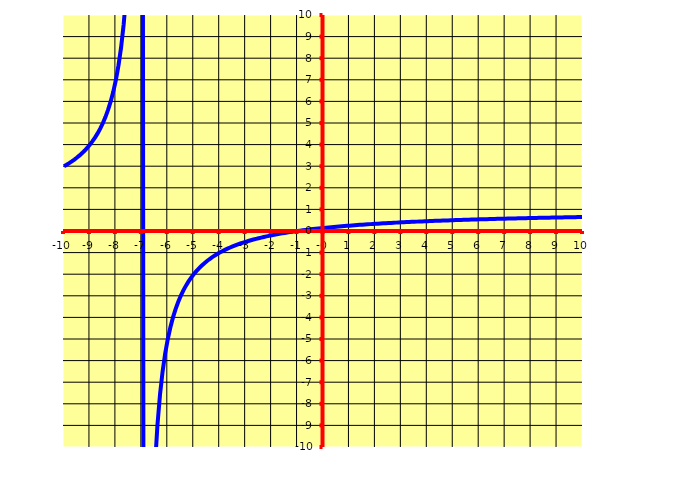
| Category | f(x) |
|---|---|
| -10.0 | 3 |
| -9.9 | 3.069 |
| -9.8 | 3.143 |
| -9.7 | 3.222 |
| -9.6 | 3.308 |
| -9.5 | 3.4 |
| -9.4 | 3.5 |
| -9.3 | 3.609 |
| -9.2 | 3.727 |
| -9.1 | 3.857 |
| -9.0 | 4 |
| -8.9 | 4.158 |
| -8.8 | 4.333 |
| -8.7 | 4.529 |
| -8.6 | 4.75 |
| -8.50000000000001 | 5 |
| -8.40000000000001 | 5.286 |
| -8.30000000000001 | 5.615 |
| -8.20000000000001 | 6 |
| -8.10000000000001 | 6.455 |
| -8.00000000000001 | 7 |
| -7.90000000000001 | 7.667 |
| -7.80000000000001 | 8.5 |
| -7.70000000000001 | 9.571 |
| -7.60000000000001 | 11 |
| -7.50000000000001 | 13 |
| -7.40000000000001 | 16 |
| -7.30000000000001 | 21 |
| -7.20000000000001 | 31 |
| -7.10000000000001 | 61 |
| -7.00000000000001 | 61 |
| -6.90000000000001 | -59 |
| -6.80000000000001 | -29 |
| -6.70000000000001 | -19 |
| -6.60000000000001 | -14 |
| -6.50000000000001 | -11 |
| -6.40000000000001 | -9 |
| -6.30000000000001 | -7.571 |
| -6.20000000000001 | -6.5 |
| -6.10000000000001 | -5.667 |
| -6.00000000000001 | -5 |
| -5.90000000000001 | -4.455 |
| -5.80000000000001 | -4 |
| -5.70000000000002 | -3.615 |
| -5.60000000000002 | -3.286 |
| -5.50000000000002 | -3 |
| -5.40000000000002 | -2.75 |
| -5.30000000000002 | -2.529 |
| -5.20000000000002 | -2.333 |
| -5.10000000000002 | -2.158 |
| -5.00000000000002 | -2 |
| -4.90000000000002 | -1.857 |
| -4.80000000000002 | -1.727 |
| -4.70000000000002 | -1.609 |
| -4.60000000000002 | -1.5 |
| -4.50000000000002 | -1.4 |
| -4.40000000000002 | -1.308 |
| -4.30000000000002 | -1.222 |
| -4.20000000000002 | -1.143 |
| -4.10000000000002 | -1.069 |
| -4.00000000000002 | -1 |
| -3.90000000000002 | -0.935 |
| -3.80000000000002 | -0.875 |
| -3.70000000000002 | -0.818 |
| -3.60000000000002 | -0.765 |
| -3.50000000000002 | -0.714 |
| -3.40000000000002 | -0.667 |
| -3.30000000000002 | -0.622 |
| -3.20000000000002 | -0.579 |
| -3.10000000000002 | -0.538 |
| -3.00000000000002 | -0.5 |
| -2.90000000000003 | -0.463 |
| -2.80000000000003 | -0.429 |
| -2.70000000000003 | -0.395 |
| -2.60000000000003 | -0.364 |
| -2.50000000000003 | -0.333 |
| -2.40000000000003 | -0.304 |
| -2.30000000000003 | -0.277 |
| -2.20000000000003 | -0.25 |
| -2.10000000000003 | -0.224 |
| -2.00000000000003 | -0.2 |
| -1.90000000000003 | -0.176 |
| -1.80000000000003 | -0.154 |
| -1.70000000000003 | -0.132 |
| -1.60000000000003 | -0.111 |
| -1.50000000000003 | -0.091 |
| -1.40000000000003 | -0.071 |
| -1.30000000000003 | -0.053 |
| -1.20000000000003 | -0.034 |
| -1.10000000000003 | -0.017 |
| -1.00000000000003 | 0 |
| -0.900000000000031 | 0.016 |
| -0.800000000000029 | 0.032 |
| -0.700000000000029 | 0.048 |
| -0.60000000000003 | 0.062 |
| -0.50000000000003 | 0.077 |
| -0.400000000000031 | 0.091 |
| -0.300000000000029 | 0.104 |
| -0.200000000000029 | 0.118 |
| -0.100000000000041 | 0.13 |
| -4.08562073062058e-14 | 0.143 |
| 0.0999999999999996 | 0.155 |
| 0.199999999999999 | 0.167 |
| 0.300000000000001 | 0.178 |
| 0.4 | 0.189 |
| 0.5 | 0.2 |
| 0.6 | 0.211 |
| 0.699999999999999 | 0.221 |
| 0.800000000000001 | 0.231 |
| 0.9 | 0.241 |
| 1.0 | 0.241 |
| 1.1 | 0.259 |
| 1.2 | 0.268 |
| 1.3 | 0.277 |
| 1.4 | 0.286 |
| 1.5 | 0.294 |
| 1.6 | 0.302 |
| 1.7 | 0.31 |
| 1.8 | 0.318 |
| 1.9 | 0.326 |
| 2.0 | 0.333 |
| 2.1 | 0.341 |
| 2.2 | 0.348 |
| 2.3 | 0.355 |
| 2.4 | 0.362 |
| 2.5 | 0.368 |
| 2.6 | 0.375 |
| 2.7 | 0.381 |
| 2.8 | 0.388 |
| 2.9 | 0.394 |
| 3.0 | 0.4 |
| 3.1 | 0.406 |
| 3.2 | 0.412 |
| 3.3 | 0.417 |
| 3.4 | 0.423 |
| 3.5 | 0.429 |
| 3.6 | 0.434 |
| 3.7 | 0.439 |
| 3.8 | 0.444 |
| 3.9 | 0.45 |
| 4.0 | 0.455 |
| 4.0999999999999 | 0.459 |
| 4.1999999999999 | 0.464 |
| 4.2999999999999 | 0.469 |
| 4.3999999999999 | 0.474 |
| 4.4999999999999 | 0.478 |
| 4.5999999999999 | 0.483 |
| 4.6999999999999 | 0.487 |
| 4.7999999999999 | 0.492 |
| 4.8999999999999 | 0.496 |
| 4.9999999999999 | 0.5 |
| 5.0999999999999 | 0.504 |
| 5.1999999999999 | 0.508 |
| 5.2999999999999 | 0.512 |
| 5.3999999999999 | 0.516 |
| 5.4999999999999 | 0.52 |
| 5.5999999999999 | 0.524 |
| 5.6999999999999 | 0.528 |
| 5.7999999999999 | 0.531 |
| 5.8999999999999 | 0.535 |
| 5.9999999999999 | 0.538 |
| 6.0999999999999 | 0.542 |
| 6.1999999999999 | 0.545 |
| 6.2999999999999 | 0.549 |
| 6.3999999999999 | 0.552 |
| 6.4999999999999 | 0.556 |
| 6.5999999999999 | 0.559 |
| 6.6999999999999 | 0.562 |
| 6.7999999999999 | 0.565 |
| 6.8999999999999 | 0.568 |
| 6.9999999999999 | 0.571 |
| 7.0999999999999 | 0.574 |
| 7.1999999999999 | 0.577 |
| 7.2999999999999 | 0.58 |
| 7.3999999999999 | 0.583 |
| 7.4999999999999 | 0.586 |
| 7.5999999999999 | 0.589 |
| 7.6999999999999 | 0.592 |
| 7.7999999999999 | 0.595 |
| 7.8999999999999 | 0.597 |
| 7.9999999999999 | 0.6 |
| 8.0999999999999 | 0.603 |
| 8.1999999999999 | 0.605 |
| 8.2999999999999 | 0.608 |
| 8.3999999999999 | 0.61 |
| 8.4999999999999 | 0.613 |
| 8.5999999999999 | 0.615 |
| 8.6999999999999 | 0.618 |
| 8.7999999999999 | 0.62 |
| 8.8999999999999 | 0.623 |
| 8.9999999999999 | 0.625 |
| 9.0999999999999 | 0.627 |
| 9.1999999999999 | 0.63 |
| 9.2999999999999 | 0.632 |
| 9.3999999999999 | 0.634 |
| 9.4999999999999 | 0.636 |
| 9.5999999999999 | 0.639 |
| 9.6999999999999 | 0.641 |
| 9.7999999999999 | 0.643 |
| 9.8999999999999 | 0.645 |
| 9.9999999999999 | 0.647 |